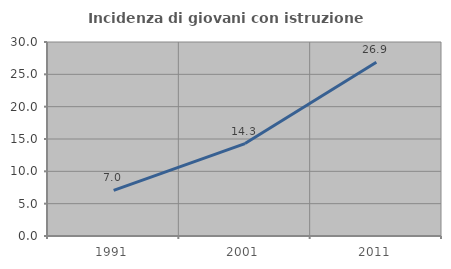
| Category | Incidenza di giovani con istruzione universitaria |
|---|---|
| 1991.0 | 7.048 |
| 2001.0 | 14.298 |
| 2011.0 | 26.869 |